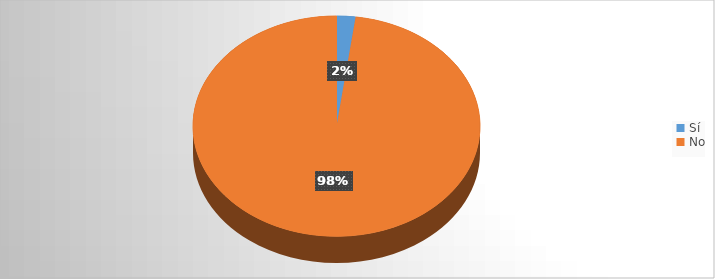
| Category | Series 0 |
|---|---|
| Sí | 2 |
| No | 92 |